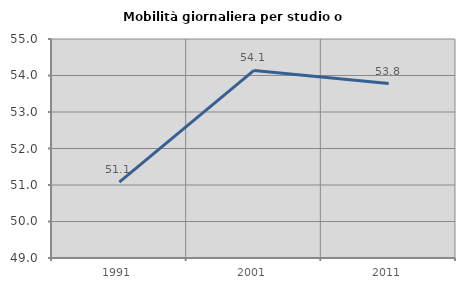
| Category | Mobilità giornaliera per studio o lavoro |
|---|---|
| 1991.0 | 51.079 |
| 2001.0 | 54.138 |
| 2011.0 | 53.779 |